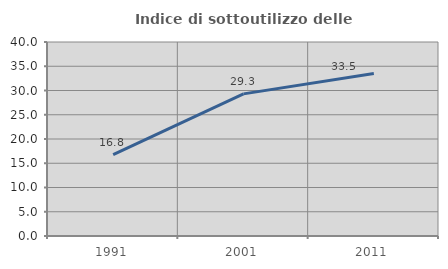
| Category | Indice di sottoutilizzo delle abitazioni  |
|---|---|
| 1991.0 | 16.763 |
| 2001.0 | 29.302 |
| 2011.0 | 33.489 |